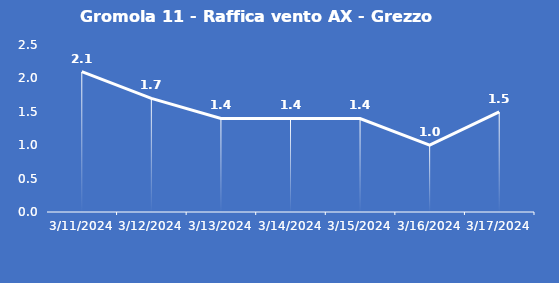
| Category | Gromola 11 - Raffica vento AX - Grezzo (m/s) |
|---|---|
| 3/11/24 | 2.1 |
| 3/12/24 | 1.7 |
| 3/13/24 | 1.4 |
| 3/14/24 | 1.4 |
| 3/15/24 | 1.4 |
| 3/16/24 | 1 |
| 3/17/24 | 1.5 |